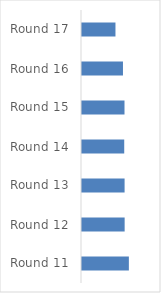
| Category | Series 0 |
|---|---|
| Round 11 | 33476 |
| Round 12 | 30461 |
| Round 13 | 30422 |
| Round 14 | 30160 |
| Round 15 | 30356 |
| Round 16 | 29263 |
| Round 17 | 23901 |